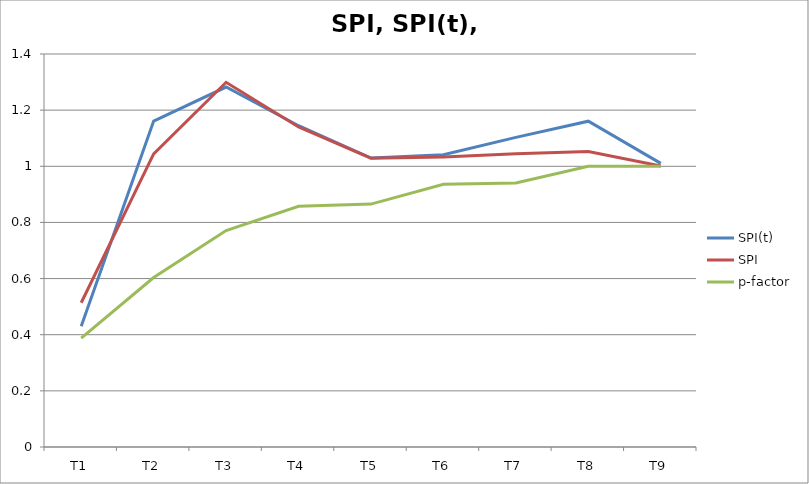
| Category | SPI(t) | SPI | p-factor |
|---|---|---|---|
| T1 | 0.431 | 0.514 | 0.388 |
| T2 | 1.161 | 1.044 | 0.604 |
| T3 | 1.282 | 1.299 | 0.771 |
| T4 | 1.145 | 1.14 | 0.858 |
| T5 | 1.029 | 1.029 | 0.865 |
| T6 | 1.041 | 1.033 | 0.936 |
| T7 | 1.103 | 1.045 | 0.94 |
| T8 | 1.161 | 1.053 | 1 |
| T9 | 1.01 | 1.001 | 1 |